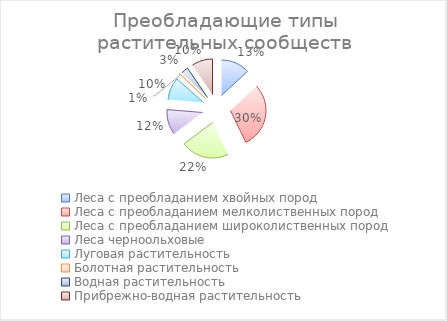
| Category | Series 0 |
|---|---|
| Леса с преобладанием хвойных пород | 13.095 |
| Леса с преобладанием мелколиственных пород | 29.762 |
| Леса с преобладанием широколиственных пород | 21.861 |
| Леса черноольховые | 11.58 |
| Луговая растительность | 10.281 |
| Болотная растительность | 0.649 |
| Водная растительность | 3.247 |
| Прибрежно-водная растительность | 9.524 |